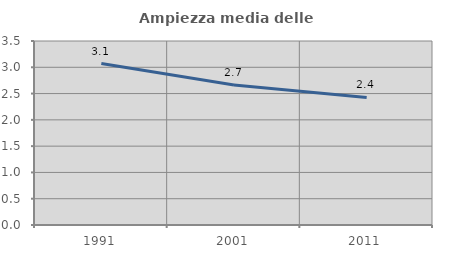
| Category | Ampiezza media delle famiglie |
|---|---|
| 1991.0 | 3.072 |
| 2001.0 | 2.661 |
| 2011.0 | 2.426 |